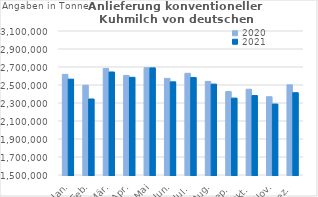
| Category | 2020 | 2021 |
|---|---|---|
| Jan. | 2618304.169 | 2564810.283 |
| Feb. | 2497066.717 | 2344313.935 |
| Mär. | 2683292.086 | 2644457.524 |
| Apr. | 2606437.198 | 2585247.668 |
| Mai | 2691839.389 | 2690134.289 |
| Jun. | 2573443.148 | 2535331.287 |
| Jul. | 2630303.063 | 2583015.964 |
| Aug. | 2539915.843 | 2509566.711 |
| Sep. | 2427075.581 | 2354501.005 |
| Okt. | 2452872.332 | 2382955.083 |
| Nov. | 2369719.719 | 2288465.603 |
| Dez. | 2501913.622 | 2414581.908 |